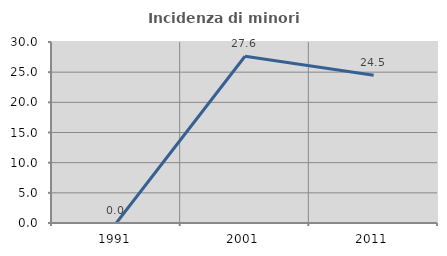
| Category | Incidenza di minori stranieri |
|---|---|
| 1991.0 | 0 |
| 2001.0 | 27.642 |
| 2011.0 | 24.487 |